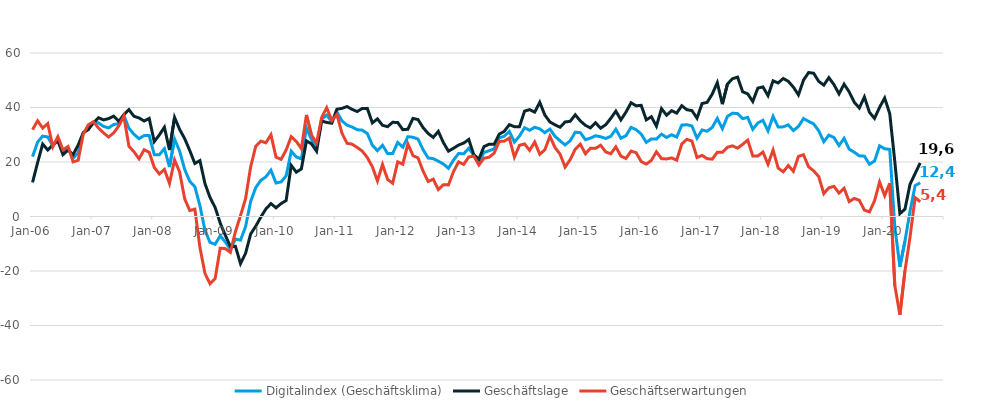
| Category | Digitalindex (Geschäftsklima) | Geschäftslage | Geschäftserwartungen |
|---|---|---|---|
| 2006-01-01 | 21.977 | 12.511 | 31.865 |
| 2006-02-01 | 27.315 | 19.775 | 35.114 |
| 2006-03-01 | 29.499 | 26.587 | 32.447 |
| 2006-04-01 | 29.191 | 24.404 | 34.079 |
| 2006-05-01 | 25.925 | 26.237 | 25.614 |
| 2006-06-01 | 28.53 | 27.769 | 29.294 |
| 2006-07-01 | 23.568 | 22.69 | 24.449 |
| 2006-08-01 | 25.029 | 24.378 | 25.682 |
| 2006-09-01 | 21.378 | 22.703 | 20.061 |
| 2006-10-01 | 23.42 | 26.251 | 20.625 |
| 2006-11-01 | 30.486 | 30.754 | 30.218 |
| 2006-12-01 | 32.77 | 31.884 | 33.658 |
| 2007-01-01 | 34.594 | 34.408 | 34.781 |
| 2007-02-01 | 34.37 | 36.256 | 32.499 |
| 2007-03-01 | 33.061 | 35.466 | 30.68 |
| 2007-04-01 | 32.517 | 35.928 | 29.155 |
| 2007-05-01 | 33.752 | 36.844 | 30.7 |
| 2007-06-01 | 34.059 | 34.889 | 33.232 |
| 2007-07-01 | 37.109 | 37.398 | 36.82 |
| 2007-08-01 | 32.403 | 39.221 | 25.779 |
| 2007-09-01 | 30.165 | 36.761 | 23.752 |
| 2007-10-01 | 28.537 | 36.163 | 21.157 |
| 2007-11-01 | 29.71 | 35.046 | 24.496 |
| 2007-12-01 | 29.695 | 35.999 | 23.559 |
| 2008-01-01 | 22.691 | 27.487 | 17.996 |
| 2008-02-01 | 22.671 | 29.952 | 15.62 |
| 2008-03-01 | 24.884 | 32.749 | 17.285 |
| 2008-04-01 | 18.161 | 24.379 | 12.115 |
| 2008-05-01 | 28.424 | 36.351 | 20.763 |
| 2008-06-01 | 24 | 31.95 | 16.323 |
| 2008-07-01 | 17.23 | 28.564 | 6.458 |
| 2008-08-01 | 12.913 | 24.206 | 2.189 |
| 2008-09-01 | 10.914 | 19.467 | 2.695 |
| 2008-10-01 | 3.956 | 20.522 | -11.365 |
| 2008-11-01 | -5.126 | 12.041 | -20.903 |
| 2008-12-01 | -9.525 | 6.951 | -24.69 |
| 2009-01-01 | -10.17 | 3.319 | -22.764 |
| 2009-02-01 | -7.072 | -2.416 | -11.619 |
| 2009-03-01 | -9.333 | -6.864 | -11.771 |
| 2009-04-01 | -12.08 | -10.983 | -13.17 |
| 2009-05-01 | -8.274 | -10.958 | -5.553 |
| 2009-06-01 | -8.686 | -17.283 | 0.315 |
| 2009-07-01 | -3.747 | -13.521 | 6.539 |
| 2009-08-01 | 5.512 | -6.443 | 18.205 |
| 2009-09-01 | 10.571 | -3.572 | 25.733 |
| 2009-10-01 | 13.263 | -0.23 | 27.668 |
| 2009-11-01 | 14.553 | 2.754 | 27.039 |
| 2009-12-01 | 17.001 | 4.737 | 29.999 |
| 2010-01-01 | 12.294 | 3.196 | 21.8 |
| 2010-02-01 | 12.691 | 4.733 | 20.959 |
| 2010-03-01 | 14.935 | 5.851 | 24.419 |
| 2010-04-01 | 23.977 | 18.769 | 29.308 |
| 2010-05-01 | 21.84 | 16.265 | 27.559 |
| 2010-06-01 | 21.15 | 17.454 | 24.909 |
| 2010-07-01 | 32.454 | 27.747 | 37.257 |
| 2010-08-01 | 28.263 | 26.658 | 29.879 |
| 2010-09-01 | 25.449 | 23.958 | 26.951 |
| 2010-10-01 | 35.701 | 35.073 | 36.33 |
| 2010-11-01 | 37.201 | 34.51 | 39.924 |
| 2010-12-01 | 34.707 | 34.247 | 35.167 |
| 2011-01-01 | 38.414 | 39.379 | 37.452 |
| 2011-02-01 | 35.087 | 39.676 | 30.586 |
| 2011-03-01 | 33.52 | 40.353 | 26.881 |
| 2011-04-01 | 32.844 | 39.322 | 26.542 |
| 2011-05-01 | 31.847 | 38.521 | 25.359 |
| 2011-06-01 | 31.693 | 39.629 | 24.018 |
| 2011-07-01 | 30.481 | 39.677 | 21.639 |
| 2011-08-01 | 26.147 | 34.357 | 18.226 |
| 2011-09-01 | 24.163 | 35.835 | 13.069 |
| 2011-10-01 | 26.159 | 33.458 | 19.088 |
| 2011-11-01 | 23.08 | 32.973 | 13.606 |
| 2011-12-01 | 23.113 | 34.583 | 12.204 |
| 2012-01-01 | 27.161 | 34.464 | 20.085 |
| 2012-02-01 | 25.429 | 31.863 | 19.173 |
| 2012-03-01 | 29.291 | 32.018 | 26.596 |
| 2012-04-01 | 29.087 | 36.007 | 22.37 |
| 2012-05-01 | 28.42 | 35.579 | 21.478 |
| 2012-06-01 | 24.484 | 32.606 | 16.646 |
| 2012-07-01 | 21.483 | 30.456 | 12.858 |
| 2012-08-01 | 21.232 | 29.028 | 13.702 |
| 2012-09-01 | 20.301 | 31.234 | 9.885 |
| 2012-10-01 | 19.264 | 27.116 | 11.683 |
| 2012-11-01 | 17.693 | 23.981 | 11.583 |
| 2012-12-01 | 20.719 | 25.037 | 16.484 |
| 2013-01-01 | 23.123 | 26.224 | 20.065 |
| 2013-02-01 | 23.005 | 26.945 | 19.134 |
| 2013-03-01 | 25.027 | 28.269 | 21.831 |
| 2013-04-01 | 22.42 | 22.679 | 22.16 |
| 2013-05-01 | 19.972 | 21.06 | 18.89 |
| 2013-06-01 | 23.5 | 25.642 | 21.379 |
| 2013-07-01 | 24.114 | 26.516 | 21.737 |
| 2013-08-01 | 24.847 | 26.503 | 23.204 |
| 2013-09-01 | 28.867 | 30.2 | 27.541 |
| 2013-10-01 | 29.435 | 31.255 | 27.629 |
| 2013-11-01 | 31.235 | 33.703 | 28.792 |
| 2013-12-01 | 27.309 | 32.959 | 21.796 |
| 2014-01-01 | 29.505 | 32.939 | 26.122 |
| 2014-02-01 | 32.576 | 38.673 | 26.634 |
| 2014-03-01 | 31.625 | 39.219 | 24.273 |
| 2014-04-01 | 32.752 | 38.296 | 27.337 |
| 2014-05-01 | 32.18 | 41.908 | 22.843 |
| 2014-06-01 | 30.767 | 37.24 | 24.471 |
| 2014-07-01 | 32.07 | 34.709 | 29.461 |
| 2014-08-01 | 29.441 | 33.634 | 25.324 |
| 2014-09-01 | 27.769 | 32.76 | 22.886 |
| 2014-10-01 | 26.264 | 34.69 | 18.14 |
| 2014-11-01 | 27.792 | 34.929 | 20.873 |
| 2014-12-01 | 30.937 | 37.323 | 24.722 |
| 2015-01-01 | 30.779 | 35.084 | 26.552 |
| 2015-02-01 | 28.17 | 33.454 | 23.005 |
| 2015-03-01 | 28.771 | 32.522 | 25.081 |
| 2015-04-01 | 29.646 | 34.389 | 24.999 |
| 2015-05-01 | 29.267 | 32.417 | 26.159 |
| 2015-06-01 | 28.63 | 33.661 | 23.708 |
| 2015-07-01 | 29.42 | 36.013 | 23.011 |
| 2015-08-01 | 32.029 | 38.67 | 25.574 |
| 2015-09-01 | 28.707 | 35.464 | 22.144 |
| 2015-10-01 | 29.647 | 38.312 | 21.297 |
| 2015-11-01 | 32.706 | 41.746 | 24.004 |
| 2015-12-01 | 31.863 | 40.623 | 23.422 |
| 2016-01-01 | 30.245 | 40.799 | 20.153 |
| 2016-02-01 | 27.202 | 35.463 | 19.23 |
| 2016-03-01 | 28.461 | 36.625 | 20.578 |
| 2016-04-01 | 28.399 | 33.147 | 23.747 |
| 2016-05-01 | 30.223 | 39.575 | 21.237 |
| 2016-06-01 | 29.006 | 37.173 | 21.12 |
| 2016-07-01 | 30.003 | 38.833 | 21.5 |
| 2016-08-01 | 29.138 | 37.94 | 20.66 |
| 2016-09-01 | 33.532 | 40.661 | 26.615 |
| 2016-10-01 | 33.691 | 39.185 | 28.322 |
| 2016-11-01 | 33.221 | 38.866 | 27.709 |
| 2016-12-01 | 28.737 | 36.069 | 21.633 |
| 2017-01-01 | 31.758 | 41.464 | 22.443 |
| 2017-02-01 | 31.314 | 41.889 | 21.201 |
| 2017-03-01 | 32.676 | 44.914 | 21.05 |
| 2017-04-01 | 36 | 49.131 | 23.561 |
| 2017-05-01 | 32.222 | 41.238 | 23.544 |
| 2017-06-01 | 36.729 | 48.604 | 25.422 |
| 2017-07-01 | 37.926 | 50.561 | 25.929 |
| 2017-08-01 | 37.759 | 51.144 | 25.088 |
| 2017-09-01 | 35.93 | 45.784 | 26.471 |
| 2017-10-01 | 36.361 | 44.992 | 28.034 |
| 2017-11-01 | 32.005 | 42.219 | 22.222 |
| 2017-12-01 | 34.328 | 47.135 | 22.185 |
| 2018-01-01 | 35.296 | 47.544 | 23.654 |
| 2018-02-01 | 31.418 | 44.346 | 19.174 |
| 2018-03-01 | 36.759 | 49.785 | 24.413 |
| 2018-04-01 | 32.873 | 49.007 | 17.785 |
| 2018-05-01 | 32.892 | 50.643 | 16.397 |
| 2018-06-01 | 33.644 | 49.607 | 18.702 |
| 2018-07-01 | 31.525 | 47.482 | 16.597 |
| 2018-08-01 | 33.06 | 44.62 | 22.046 |
| 2018-09-01 | 35.956 | 50.046 | 22.66 |
| 2018-10-01 | 34.899 | 52.833 | 18.237 |
| 2018-11-01 | 33.976 | 52.581 | 16.741 |
| 2018-12-01 | 31.457 | 49.573 | 14.655 |
| 2019-01-01 | 27.437 | 48.227 | 8.388 |
| 2019-02-01 | 29.864 | 50.956 | 10.544 |
| 2019-03-01 | 28.968 | 48.406 | 11.052 |
| 2019-04-01 | 26.057 | 44.987 | 8.59 |
| 2019-05-01 | 28.668 | 48.566 | 10.363 |
| 2019-06-01 | 24.714 | 45.758 | 5.472 |
| 2019-07-01 | 23.592 | 41.942 | 6.634 |
| 2019-08-01 | 22.252 | 39.83 | 5.964 |
| 2019-09-01 | 22.14 | 43.861 | 2.354 |
| 2019-10-01 | 19.21 | 38.248 | 1.692 |
| 2019-11-01 | 20.359 | 36.001 | 5.754 |
| 2019-12-01 | 25.941 | 40.077 | 12.637 |
| 2020-01-01 | 24.857 | 43.481 | 7.657 |
| 2020-02-01 | 24.625 | 37.762 | 12.214 |
| 2020-03-01 | -3.889 | 20.157 | -25.309 |
| 2020-04-01 | -18.451 | 1.046 | -36.057 |
| 2020-05-01 | -8.979 | 2.692 | -19.978 |
| 2020-06-01 | 1.932 | 11.824 | -7.499 |
| 2020-07-01 | 11.306 | 15.747 | 6.957 |
| 2020-08-01 | 12.404 | 19.643 | 5.404 |